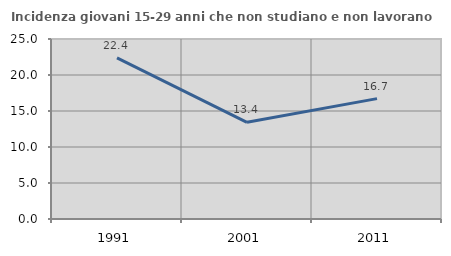
| Category | Incidenza giovani 15-29 anni che non studiano e non lavorano  |
|---|---|
| 1991.0 | 22.39 |
| 2001.0 | 13.432 |
| 2011.0 | 16.721 |